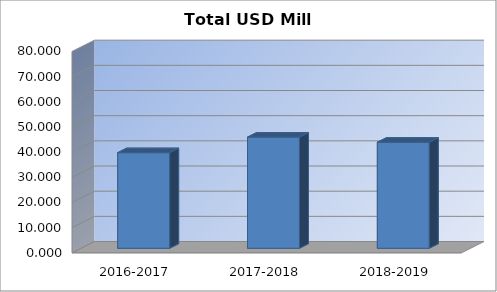
| Category | Total USD Mill Rates |
|---|---|
| 2016-2017 | 37.987 |
| 2017-2018 | 44.163 |
| 2018-2019 | 42.121 |